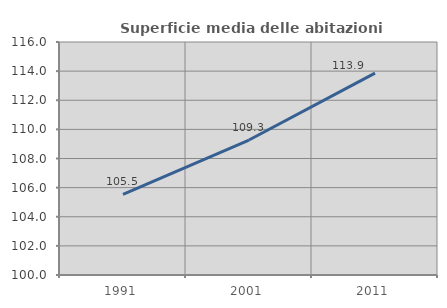
| Category | Superficie media delle abitazioni occupate |
|---|---|
| 1991.0 | 105.542 |
| 2001.0 | 109.269 |
| 2011.0 | 113.866 |